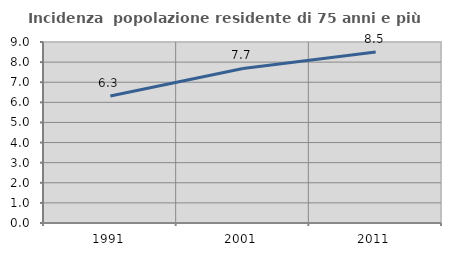
| Category | Incidenza  popolazione residente di 75 anni e più |
|---|---|
| 1991.0 | 6.319 |
| 2001.0 | 7.686 |
| 2011.0 | 8.505 |